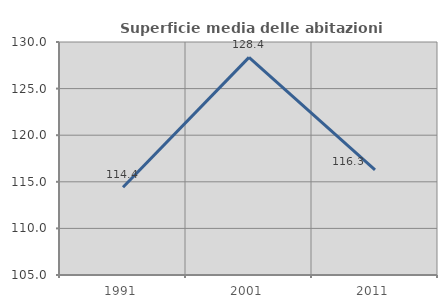
| Category | Superficie media delle abitazioni occupate |
|---|---|
| 1991.0 | 114.411 |
| 2001.0 | 128.353 |
| 2011.0 | 116.291 |